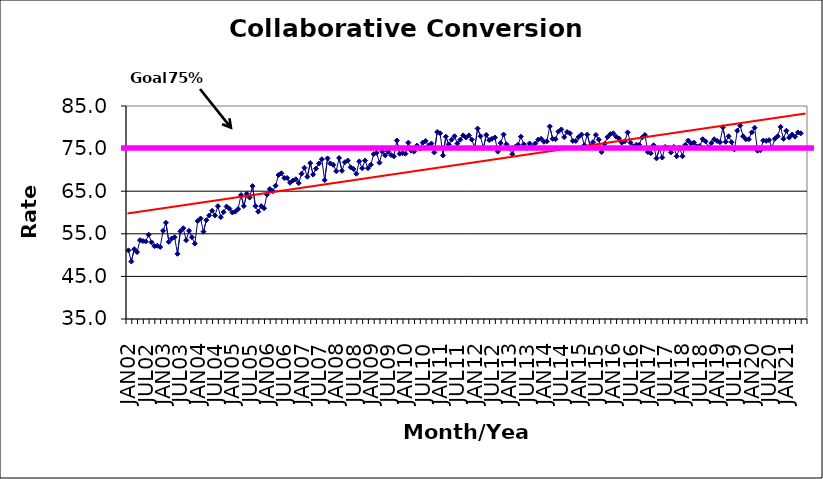
| Category | Series 0 |
|---|---|
| JAN02 | 51.1 |
| FEB02 | 48.5 |
| MAR02 | 51.4 |
| APR02 | 50.7 |
| MAY02 | 53.5 |
| JUN02 | 53.3 |
| JUL02 | 53.2 |
| AUG02 | 54.8 |
| SEP02 | 53 |
| OCT02 | 52.1 |
| NOV02 | 52.2 |
| DEC02 | 51.9 |
| JAN03 | 55.7 |
| FEB03 | 57.6 |
| MAR03 | 53.1 |
| APR03 | 53.9 |
| MAY03 | 54.2 |
| JUN03 | 50.3 |
| JUL03 | 55.6 |
| AUG03 | 56.3 |
| SEP03 | 53.5 |
| OCT03 | 55.7 |
| NOV03 | 54.2 |
| DEC03 | 52.7 |
| JAN04 | 58 |
| FEB04 | 58.6 |
| MAR04 | 55.5 |
| APR04 | 58.2 |
| MAY04 | 59.3 |
| JUN04 | 60.4 |
| JUL04 | 59.3 |
| AUG04 | 61.5 |
| SEP04 | 58.9 |
| OCT04 | 60.1 |
| NOV04 | 61.4 |
| DEC04 | 60.9 |
| JAN05 | 60 |
| FEB05 | 60.2 |
| MAR05 | 60.8 |
| APR05 | 64.1 |
| MAY05 | 61.5 |
| JUN05 | 64.4 |
| JUL05 | 63.5 |
| AUG05 | 66.2 |
| SEP05 | 61.5 |
| OCT05 | 60.2 |
| NOV05 | 61.5 |
| DEC05 | 61 |
| JAN06 | 64.2 |
| FEB06 | 65.5 |
| MAR06 | 65 |
| APR06 | 66.3 |
| MAY06 | 68.8 |
| JUN06 | 69.2 |
| JUL06 | 68.1 |
| AUG06 | 68.1 |
| SEP06 | 67 |
| OCT06 | 67.5 |
| NOV06 | 67.8 |
| DEC06 | 66.9 |
| JAN07 | 69.1 |
| FEB07 | 70.5 |
| MAR07 | 68.4 |
| APR07 | 71.6 |
| MAY07 | 68.9 |
| JUN07 | 70.3 |
| JUL07 | 71.5 |
| AUG07 | 72.5 |
| SEP07 | 67.6 |
| OCT07 | 72.7 |
| NOV07 | 71.5 |
| DEC07 | 71.2 |
| JAN08 | 69.7 |
| FEB08 | 72.8 |
| MAR08 | 69.8 |
| APR08 | 71.8 |
| MAY08 | 72.2 |
| JUN08 | 70.6 |
| JUL08 | 70.2 |
| AUG08 | 69.1 |
| SEP08 | 72 |
| OCT08 | 70.4 |
| NOV08 | 72.2 |
| DEC08 | 70.4 |
| JAN09 | 71.2 |
| FEB09 | 73.7 |
| MAR09 | 74 |
| APR09 | 71.7 |
| MAY09 | 74.3 |
| JUN09 | 73.4 |
| JUL09 | 74.3 |
| AUG09 | 73.5 |
| SEP09 | 73.2 |
| OCT09 | 76.9 |
| NOV09 | 73.8 |
| DEC09 | 73.9 |
| JAN10 | 73.8 |
| FEB10 | 76.4 |
| MAR10 | 74.5 |
| APR10 | 74.3 |
| MAY10 | 75.7 |
| JUN10 | 75 |
| JUL10 | 76.4 |
| AUG10 | 76.8 |
| SEP10 | 75.7 |
| OCT10 | 76.2 |
| NOV10 | 74.1 |
| DEC10 | 78.9 |
| JAN11 | 78.6 |
| FEB11 | 73.4 |
| MAR11 | 77.8 |
| APR11 | 76 |
| MAY11 | 77.1 |
| JUN11 | 77.9 |
| JUL11 | 76.2 |
| AUG11 | 77.1 |
| SEP11 | 78.1 |
| OCT11 | 77.6 |
| NOV11 | 78.1 |
| DEC11 | 77.1 |
| JAN12 | 75.2 |
| FEB12 | 79.7 |
| MAR12 | 77.9 |
| APR12 | 75.1 |
| MAY12 | 78.2 |
| JUN12 | 77 |
| JUL12 | 77.3 |
| AUG12 | 77.6 |
| SEP12 | 74.3 |
| OCT12 | 76.3 |
| NOV12 | 78.3 |
| DEC12 | 76 |
| JAN13 | 75.1 |
| FEB13 | 73.7 |
| MAR13 | 75.4 |
| APR13 | 75.9 |
| MAY13 | 77.8 |
| JUN13 | 76 |
| JUL13 | 75.1 |
| AUG13 | 76.2 |
| SEP13 | 75.4 |
| OCT13 | 76.2 |
| NOV13 | 77.1 |
| DEC13 | 77.3 |
| JAN14 | 76.6 |
| FEB14 | 76.7 |
| MAR14 | 80.2 |
| APR14 | 77.3 |
| MAY14 | 77.2 |
| JUN14 | 79 |
| JUL14 | 79.5 |
| AUG14 | 77.7 |
| SEP14 | 78.9 |
| OCT14 | 78.6 |
| NOV14 | 76.8 |
| DEC14 | 76.8 |
| JAN15 | 77.7 |
| FEB15 | 78.3 |
| MAR15 | 75.8 |
| APR15 | 78.3 |
| MAY15 | 75.6 |
| JUN15 | 76.5 |
| JUL15 | 78.2 |
| AUG15 | 77.1 |
| SEP15 | 74.2 |
| OCT15 | 76.1 |
| NOV15 | 77.7 |
| DEC15 | 78.4 |
| JAN16 | 78.6 |
| FEB16 | 77.8 |
| MAR16 | 77.4 |
| APR16 | 76.4 |
| MAY16 | 76.7 |
| JUN16 | 78.8 |
| JUL16 | 76.4 |
| AUG16 | 75.5 |
| SEP16 | 75.9 |
| OCT16 | 75.9 |
| NOV16 | 77.6 |
| DEC16 | 78.2 |
| JAN17 | 74.2 |
| FEB17 | 73.9 |
| MAR17 | 75.8 |
| APR17 | 72.7 |
| MAY17 | 75 |
| JUN17 | 72.9 |
| JUL17 | 75.4 |
| AUG17 | 75.2 |
| SEP17 | 74.1 |
| OCT17 | 75.4 |
| NOV17 | 73.2 |
| DEC17 | 75.2 |
| JAN18 | 73.2 |
| FEB18 | 75.9 |
| MAR18 | 76.9 |
| APR18 | 76.2 |
| MAY18 | 76.4 |
| JUN18 | 75.5 |
| JUL18 | 75.6 |
| AUG18 | 77.2 |
| SEP18 | 76.7 |
| OCT18 | 75.3 |
| NOV18 | 76.3 |
| DEC18 | 77.2 |
| JAN19 | 76.8 |
| FEB19 | 76.5 |
| MAR19 | 80 |
| APR19 | 76.6 |
| MAY19 | 77.9 |
| JUN19 | 76.5 |
| JUL19 | 74.8 |
| AUG19 | 79.2 |
| SEP19 | 80.4 |
| OCT19 | 77.9 |
| NOV19 | 77.2 |
| DEC19 | 77.2 |
| JAN20 | 78.8 |
| FEB20 | 79.9 |
| MAR20 | 74.5 |
| APR20 | 74.6 |
| MAY20 | 76.9 |
| JUN20 | 76.8 |
| JUL20 | 77 |
| AUG20 | 75.2 |
| SEP20 | 77.3 |
| OCT20 | 77.9 |
| NOV20 | 80.1 |
| DEC20 | 77.3 |
| JAN21 | 79.2 |
| FEB21 | 77.6 |
| MAR21 | 78.3 |
| APR21 | 77.8 |
| MAY21 | 78.8 |
| JUN21 | 78.6 |